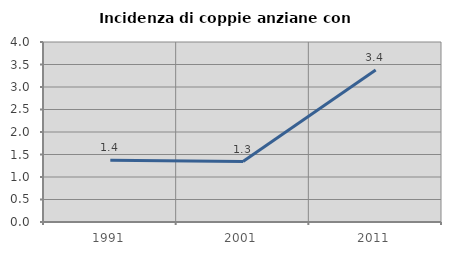
| Category | Incidenza di coppie anziane con figli |
|---|---|
| 1991.0 | 1.37 |
| 2001.0 | 1.342 |
| 2011.0 | 3.378 |